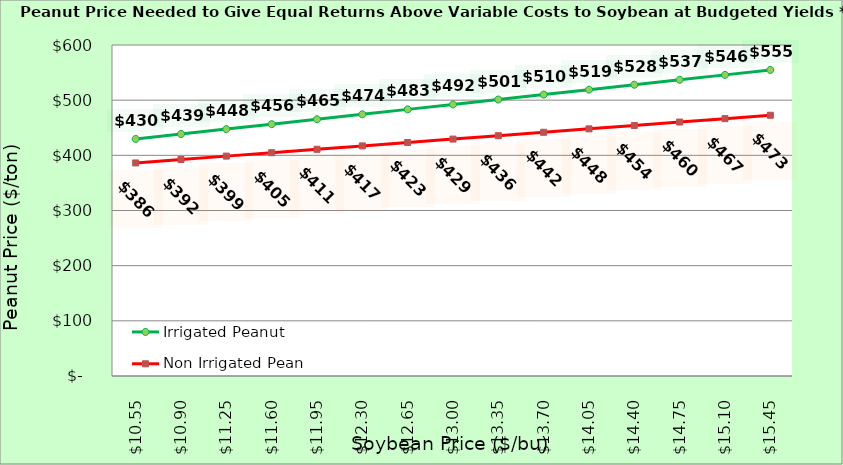
| Category | Irrigated Peanut | Non Irrigated Peanut |
|---|---|---|
| 10.550000000000002 | 429.679 | 386.215 |
| 10.900000000000002 | 438.615 | 392.392 |
| 11.250000000000002 | 447.551 | 398.568 |
| 11.600000000000001 | 456.487 | 404.745 |
| 11.950000000000001 | 465.423 | 410.921 |
| 12.3 | 474.359 | 417.098 |
| 12.65 | 483.296 | 423.274 |
| 13.0 | 492.232 | 429.451 |
| 13.35 | 501.168 | 435.627 |
| 13.7 | 510.104 | 441.804 |
| 14.049999999999999 | 519.04 | 447.98 |
| 14.399999999999999 | 527.977 | 454.157 |
| 14.749999999999998 | 536.913 | 460.333 |
| 15.099999999999998 | 545.849 | 466.51 |
| 15.449999999999998 | 554.785 | 472.686 |